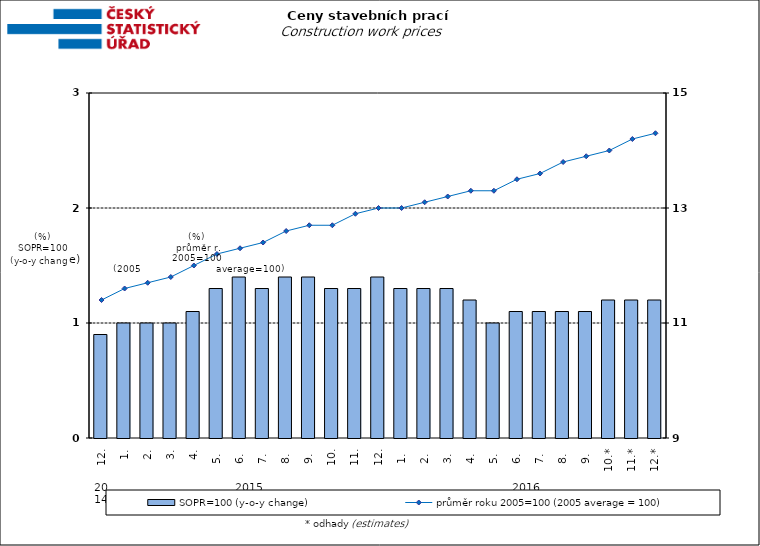
| Category | SOPR=100 (y-o-y change)   |
|---|---|
| 0 | 0.9 |
| 1 | 1 |
| 2 | 1 |
| 3 | 1 |
| 4 | 1.1 |
| 5 | 1.3 |
| 6 | 1.4 |
| 7 | 1.3 |
| 8 | 1.4 |
| 9 | 1.4 |
| 10 | 1.3 |
| 11 | 1.3 |
| 12 | 1.4 |
| 13 | 1.3 |
| 14 | 1.3 |
| 15 | 1.3 |
| 16 | 1.2 |
| 17 | 1 |
| 18 | 1.1 |
| 19 | 1.1 |
| 20 | 1.1 |
| 21 | 1.1 |
| 22 | 1.2 |
| 23 | 1.2 |
| 24 | 1.2 |